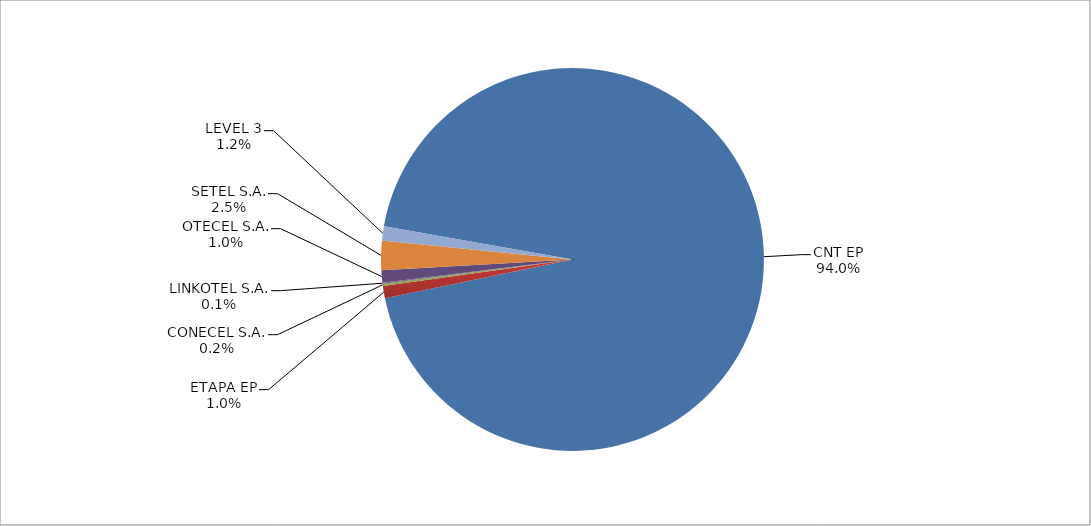
| Category | Series 0 |
|---|---|
| CNT EP | 2451 |
| ETAPA EP | 27 |
| CONECEL S.A. | 5 |
| LINKOTEL S.A. | 2 |
| OTECEL S.A. | 27 |
| SETEL S.A. | 65 |
| LEVEL 3 | 31 |